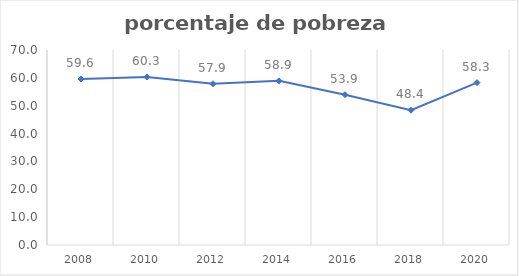
| Category | Series 0 |
|---|---|
| 2008.0 | 59.578 |
| 2010.0 | 60.313 |
| 2012.0 | 57.879 |
| 2014.0 | 58.928 |
| 2016.0 | 53.946 |
| 2018.0 | 48.379 |
| 2020.0 | 58.283 |